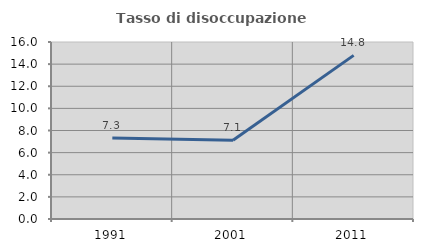
| Category | Tasso di disoccupazione giovanile  |
|---|---|
| 1991.0 | 7.317 |
| 2001.0 | 7.123 |
| 2011.0 | 14.791 |